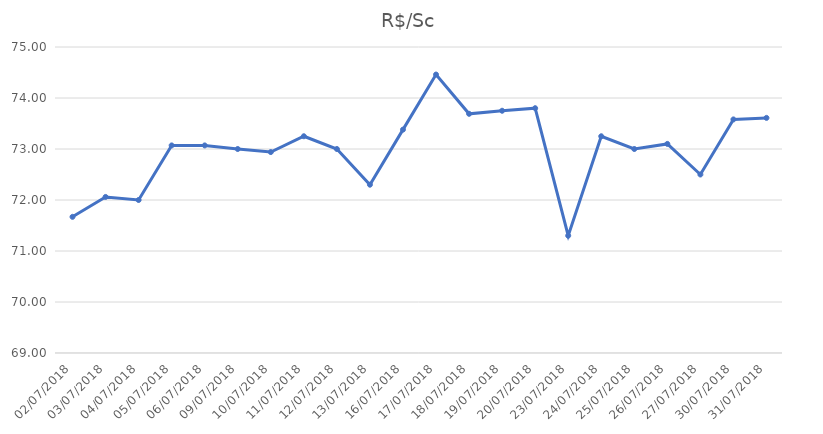
| Category | R$/Sc |
|---|---|
| 02/07/2018 | 71.67 |
| 03/07/2018 | 72.06 |
| 04/07/2018 | 72 |
| 05/07/2018 | 73.07 |
| 06/07/2018 | 73.07 |
| 09/07/2018 | 73 |
| 10/07/2018 | 72.94 |
| 11/07/2018 | 73.25 |
| 12/07/2018 | 73 |
| 13/07/2018 | 72.3 |
| 16/07/2018 | 73.38 |
| 17/07/2018 | 74.46 |
| 18/07/2018 | 73.69 |
| 19/07/2018 | 73.75 |
| 20/07/2018 | 73.8 |
| 23/07/2018 | 71.3 |
| 24/07/2018 | 73.25 |
| 25/07/2018 | 73 |
| 26/07/2018 | 73.1 |
| 27/07/2018 | 72.5 |
| 30/07/2018 | 73.58 |
| 31/07/2018 | 73.61 |